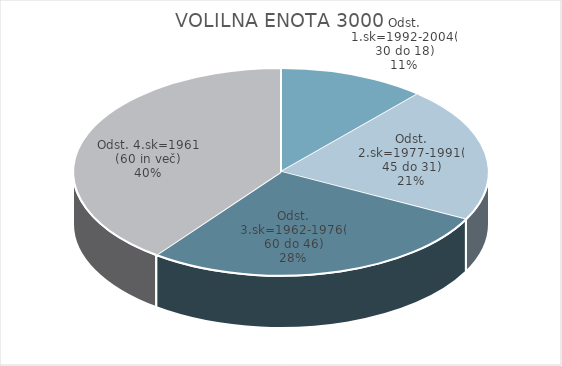
| Category | VOLILNA ENOTA 3000 |
|---|---|
| Odst. 1.sk=1992-2004(30 do 18) | 5.37 |
| Odst. 2.sk=1977-1991(45 do 31) | 9.89 |
| Odst. 3.sk=1962-1976(60 do 46) | 12.95 |
| Odst. 4.sk=1961 (60 in več) | 18.63 |